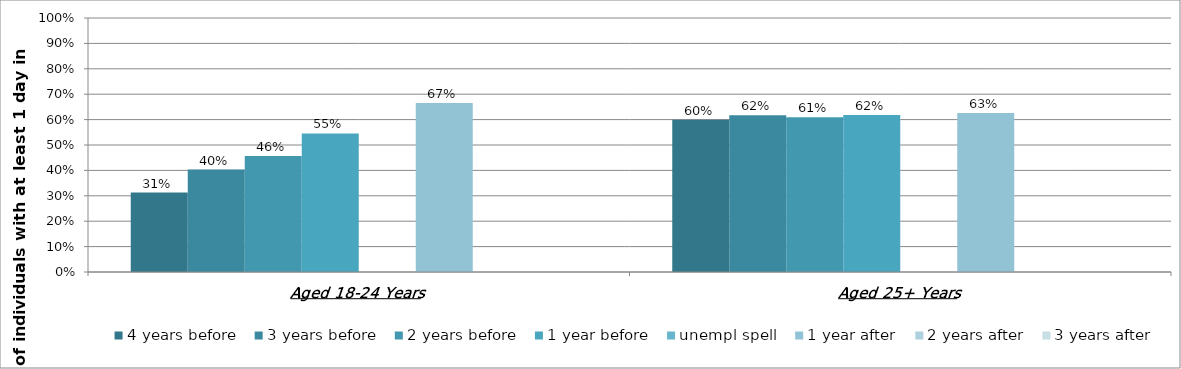
| Category | 4 years before | 3 years before | 2 years before | 1 year before | unempl spell | 1 year after | 2 years after | 3 years after |
|---|---|---|---|---|---|---|---|---|
| Aged 18-24 Years | 0.313 | 0.403 | 0.456 | 0.546 |  | 0.665 | 0 | 0 |
| Aged 25+ Years | 0.599 | 0.617 | 0.609 | 0.618 |  | 0.626 | 0 | 0 |